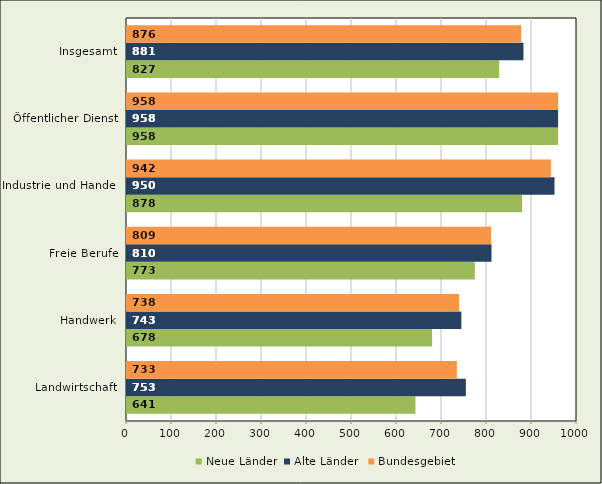
| Category | Neue Länder | Alte Länder  | Bundesgebiet |
|---|---|---|---|
| Landwirtschaft | 641 | 753 | 733 |
| Handwerk | 678 | 743 | 738 |
| Freie Berufe | 773 | 810 | 809 |
| Industrie und Handel | 878 | 950 | 942 |
| Öffentlicher Dienst | 958 | 958 | 958 |
| Insgesamt | 827 | 881 | 876 |